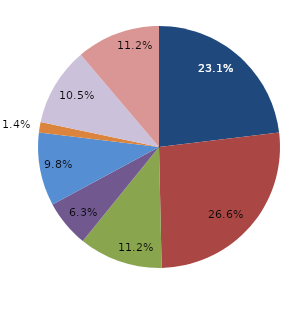
| Category | Series 0 |
|---|---|
| قبل الدخول | 23.077 |
| -1 | 26.573 |
| 1 | 11.189 |
| 2 | 6.294 |
| 3 | 9.79 |
| 4 | 1.399 |
|  5 - 9 | 10.49 |
| 10 - 14 | 11.189 |